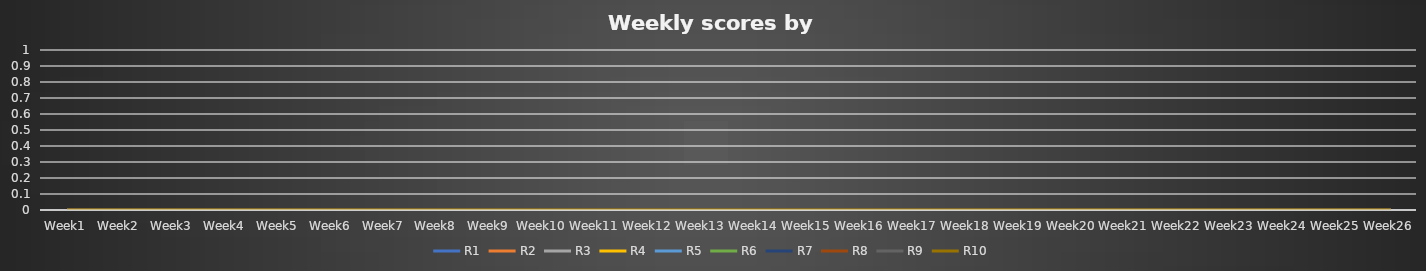
| Category | R1 | R2 | R3 | R4 | R5 | R6 | R7 | R8 | R9 | R10 |
|---|---|---|---|---|---|---|---|---|---|---|
| Week1 | 0 | 0 | 0 | 0 | 0 | 0 | 0 | 0 | 0 | 0 |
| Week2 | 0 | 0 | 0 | 0 | 0 | 0 | 0 | 0 | 0 | 0 |
| Week3 | 0 | 0 | 0 | 0 | 0 | 0 | 0 | 0 | 0 | 0 |
| Week4 | 0 | 0 | 0 | 0 | 0 | 0 | 0 | 0 | 0 | 0 |
| Week5 | 0 | 0 | 0 | 0 | 0 | 0 | 0 | 0 | 0 | 0 |
| Week6 | 0 | 0 | 0 | 0 | 0 | 0 | 0 | 0 | 0 | 0 |
| Week7 | 0 | 0 | 0 | 0 | 0 | 0 | 0 | 0 | 0 | 0 |
| Week8 | 0 | 0 | 0 | 0 | 0 | 0 | 0 | 0 | 0 | 0 |
| Week9 | 0 | 0 | 0 | 0 | 0 | 0 | 0 | 0 | 0 | 0 |
| Week10 | 0 | 0 | 0 | 0 | 0 | 0 | 0 | 0 | 0 | 0 |
| Week11 | 0 | 0 | 0 | 0 | 0 | 0 | 0 | 0 | 0 | 0 |
| Week12 | 0 | 0 | 0 | 0 | 0 | 0 | 0 | 0 | 0 | 0 |
| Week13 | 0 | 0 | 0 | 0 | 0 | 0 | 0 | 0 | 0 | 0 |
| Week14 | 0 | 0 | 0 | 0 | 0 | 0 | 0 | 0 | 0 | 0 |
| Week15 | 0 | 0 | 0 | 0 | 0 | 0 | 0 | 0 | 0 | 0 |
| Week16 | 0 | 0 | 0 | 0 | 0 | 0 | 0 | 0 | 0 | 0 |
| Week17 | 0 | 0 | 0 | 0 | 0 | 0 | 0 | 0 | 0 | 0 |
| Week18 | 0 | 0 | 0 | 0 | 0 | 0 | 0 | 0 | 0 | 0 |
| Week19 | 0 | 0 | 0 | 0 | 0 | 0 | 0 | 0 | 0 | 0 |
| Week20 | 0 | 0 | 0 | 0 | 0 | 0 | 0 | 0 | 0 | 0 |
| Week21 | 0 | 0 | 0 | 0 | 0 | 0 | 0 | 0 | 0 | 0 |
| Week22 | 0 | 0 | 0 | 0 | 0 | 0 | 0 | 0 | 0 | 0 |
| Week23 | 0 | 0 | 0 | 0 | 0 | 0 | 0 | 0 | 0 | 0 |
| Week24 | 0 | 0 | 0 | 0 | 0 | 0 | 0 | 0 | 0 | 0 |
| Week25 | 0 | 0 | 0 | 0 | 0 | 0 | 0 | 0 | 0 | 0 |
| Week26 | 0 | 0 | 0 | 0 | 0 | 0 | 0 | 0 | 0 | 0 |